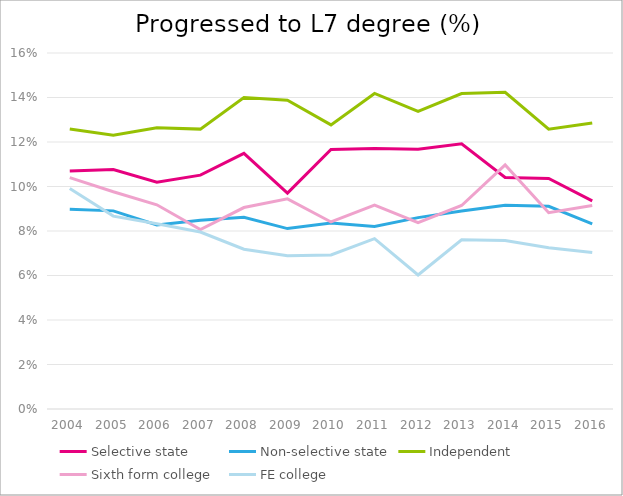
| Category | Selective state | Non-selective state | Independent | Sixth form college | FE college |
|---|---|---|---|---|---|
| 2004.0 | 0.107 | 0.09 | 0.126 | 0.104 | 0.099 |
| 2005.0 | 0.108 | 0.089 | 0.123 | 0.098 | 0.087 |
| 2006.0 | 0.102 | 0.083 | 0.126 | 0.092 | 0.083 |
| 2007.0 | 0.105 | 0.085 | 0.126 | 0.081 | 0.08 |
| 2008.0 | 0.115 | 0.086 | 0.14 | 0.091 | 0.072 |
| 2009.0 | 0.097 | 0.081 | 0.139 | 0.094 | 0.069 |
| 2010.0 | 0.117 | 0.084 | 0.128 | 0.084 | 0.069 |
| 2011.0 | 0.117 | 0.082 | 0.142 | 0.092 | 0.077 |
| 2012.0 | 0.117 | 0.086 | 0.134 | 0.084 | 0.06 |
| 2013.0 | 0.119 | 0.089 | 0.142 | 0.091 | 0.076 |
| 2014.0 | 0.104 | 0.092 | 0.142 | 0.11 | 0.076 |
| 2015.0 | 0.104 | 0.091 | 0.126 | 0.088 | 0.073 |
| 2016.0 | 0.094 | 0.083 | 0.129 | 0.091 | 0.07 |